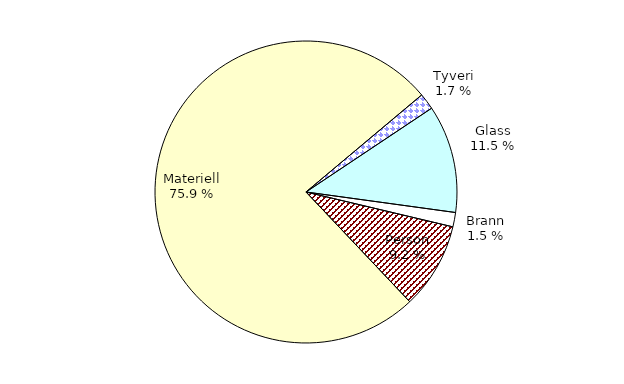
| Category | Series 0 |
|---|---|
| Tyveri | 223.208 |
| Glass | 1471.147 |
| Brann | 196.176 |
| Person | 1178.149 |
| Materiell | 9687.074 |